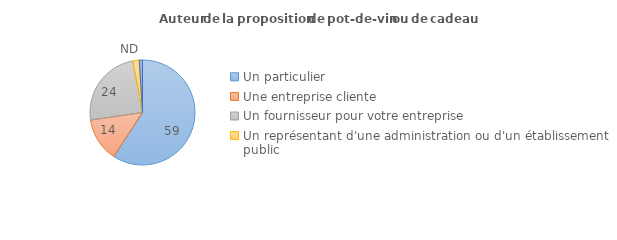
| Category | Series 0 |
|---|---|
| Un particulier | 59.168 |
| Une entreprise cliente  | 13.52 |
| Un fournisseur pour votre entreprise | 24.298 |
| Un représentant d'une administration ou d'un établissement public | 2 |
| NSP | 1 |